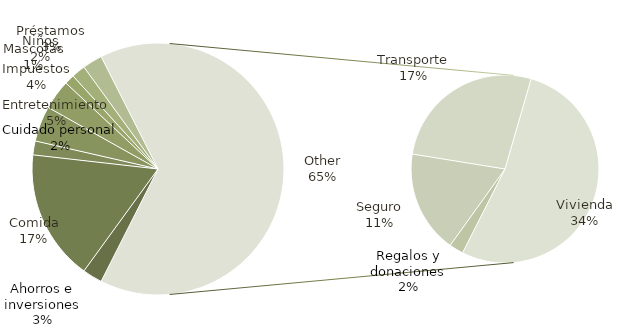
| Category | Total |
|---|---|
| Ahorros e inversiones | 200 |
| Comida | 1320 |
| Cuidado personal | 140 |
| Entretenimiento | 358 |
| Impuestos | 300 |
| Mascotas | 100 |
| Niños | 140 |
| Préstamos | 200 |
| Regalos y donaciones | 125 |
| Seguro | 900 |
| Transporte | 1375 |
| Vivienda | 2702 |